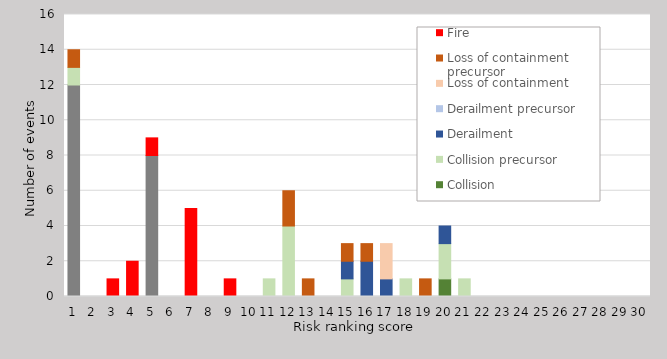
| Category | Admin error | Collision | Collision precursor | Derailment | Derailment precursor | Loss of containment | Loss of containment precursor | Fire |
|---|---|---|---|---|---|---|---|---|
| 0 | 12 | 0 | 1 | 0 | 0 | 0 | 1 | 0 |
| 1 | 0 | 0 | 0 | 0 | 0 | 0 | 0 | 0 |
| 2 | 0 | 0 | 0 | 0 | 0 | 0 | 0 | 1 |
| 3 | 0 | 0 | 0 | 0 | 0 | 0 | 0 | 2 |
| 4 | 8 | 0 | 0 | 0 | 0 | 0 | 0 | 1 |
| 5 | 0 | 0 | 0 | 0 | 0 | 0 | 0 | 0 |
| 6 | 0 | 0 | 0 | 0 | 0 | 0 | 0 | 5 |
| 7 | 0 | 0 | 0 | 0 | 0 | 0 | 0 | 0 |
| 8 | 0 | 0 | 0 | 0 | 0 | 0 | 0 | 1 |
| 9 | 0 | 0 | 0 | 0 | 0 | 0 | 0 | 0 |
| 10 | 0 | 0 | 1 | 0 | 0 | 0 | 0 | 0 |
| 11 | 0 | 0 | 4 | 0 | 0 | 0 | 2 | 0 |
| 12 | 0 | 0 | 0 | 0 | 0 | 0 | 1 | 0 |
| 13 | 0 | 0 | 0 | 0 | 0 | 0 | 0 | 0 |
| 14 | 0 | 0 | 1 | 1 | 0 | 0 | 1 | 0 |
| 15 | 0 | 0 | 0 | 2 | 0 | 0 | 1 | 0 |
| 16 | 0 | 0 | 0 | 1 | 0 | 2 | 0 | 0 |
| 17 | 0 | 0 | 1 | 0 | 0 | 0 | 0 | 0 |
| 18 | 0 | 0 | 0 | 0 | 0 | 0 | 1 | 0 |
| 19 | 0 | 1 | 2 | 1 | 0 | 0 | 0 | 0 |
| 20 | 0 | 0 | 1 | 0 | 0 | 0 | 0 | 0 |
| 21 | 0 | 0 | 0 | 0 | 0 | 0 | 0 | 0 |
| 22 | 0 | 0 | 0 | 0 | 0 | 0 | 0 | 0 |
| 23 | 0 | 0 | 0 | 0 | 0 | 0 | 0 | 0 |
| 24 | 0 | 0 | 0 | 0 | 0 | 0 | 0 | 0 |
| 25 | 0 | 0 | 0 | 0 | 0 | 0 | 0 | 0 |
| 26 | 0 | 0 | 0 | 0 | 0 | 0 | 0 | 0 |
| 27 | 0 | 0 | 0 | 0 | 0 | 0 | 0 | 0 |
| 28 | 0 | 0 | 0 | 0 | 0 | 0 | 0 | 0 |
| 29 | 0 | 0 | 0 | 0 | 0 | 0 | 0 | 0 |